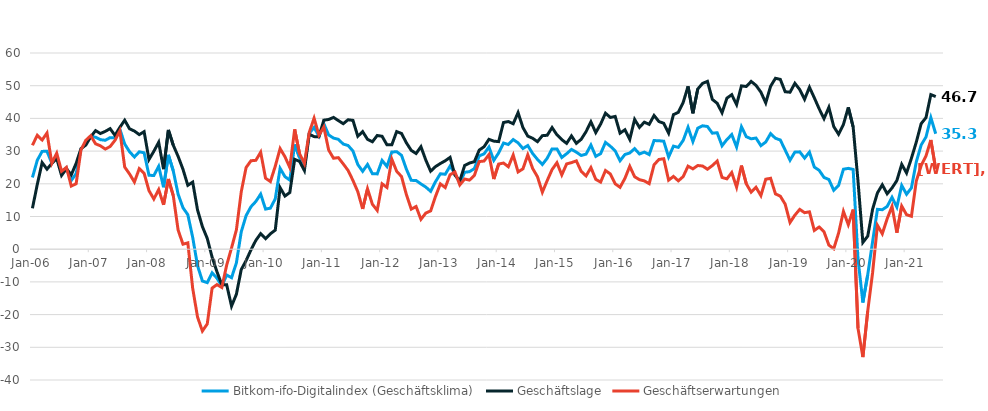
| Category | Bitkom-ifo-Digitalindex (Geschäftsklima) | Geschäftslage | Geschäftserwartungen |
|---|---|---|---|
| 2006-01-01 | 21.93 | 12.5 | 31.78 |
| 2006-02-01 | 27.2 | 19.8 | 34.84 |
| 2006-03-01 | 29.91 | 26.49 | 33.39 |
| 2006-04-01 | 29.94 | 24.48 | 35.54 |
| 2006-05-01 | 26.28 | 26.24 | 26.32 |
| 2006-06-01 | 28.53 | 27.71 | 29.36 |
| 2006-07-01 | 23.19 | 22.56 | 23.83 |
| 2006-08-01 | 24.81 | 24.6 | 25.03 |
| 2006-09-01 | 21.02 | 22.75 | 19.31 |
| 2006-10-01 | 23.11 | 26.25 | 20.01 |
| 2006-11-01 | 30.56 | 30.75 | 30.36 |
| 2006-12-01 | 32.58 | 31.85 | 33.32 |
| 2007-01-01 | 34.53 | 34.37 | 34.7 |
| 2007-02-01 | 34.23 | 36.26 | 32.23 |
| 2007-03-01 | 33.49 | 35.38 | 31.62 |
| 2007-04-01 | 33.31 | 36.03 | 30.62 |
| 2007-05-01 | 34.12 | 36.87 | 31.4 |
| 2007-06-01 | 34.05 | 34.81 | 33.3 |
| 2007-07-01 | 36.73 | 37.26 | 36.2 |
| 2007-08-01 | 32.17 | 39.44 | 25.12 |
| 2007-09-01 | 29.81 | 36.82 | 23 |
| 2007-10-01 | 28.2 | 36.13 | 20.54 |
| 2007-11-01 | 29.78 | 35.04 | 24.64 |
| 2007-12-01 | 29.49 | 35.94 | 23.22 |
| 2008-01-01 | 22.62 | 27.42 | 17.91 |
| 2008-02-01 | 22.53 | 29.95 | 15.35 |
| 2008-03-01 | 25.35 | 32.7 | 18.23 |
| 2008-04-01 | 18.96 | 24.47 | 13.58 |
| 2008-05-01 | 28.84 | 36.47 | 21.47 |
| 2008-06-01 | 23.97 | 31.81 | 16.39 |
| 2008-07-01 | 16.82 | 28.38 | 5.84 |
| 2008-08-01 | 12.68 | 24.44 | 1.53 |
| 2008-09-01 | 10.55 | 19.53 | 1.94 |
| 2008-10-01 | 3.62 | 20.52 | -11.98 |
| 2008-11-01 | -5.06 | 12 | -20.76 |
| 2008-12-01 | -9.73 | 6.91 | -25.03 |
| 2009-01-01 | -10.22 | 3.3 | -22.85 |
| 2009-02-01 | -7.22 | -2.43 | -11.89 |
| 2009-03-01 | -8.87 | -6.9 | -10.83 |
| 2009-04-01 | -11.29 | -10.88 | -11.7 |
| 2009-05-01 | -7.9 | -10.9 | -4.85 |
| 2009-06-01 | -8.72 | -17.41 | 0.39 |
| 2009-07-01 | -4.17 | -13.77 | 5.92 |
| 2009-08-01 | 5.32 | -6.22 | 17.55 |
| 2009-09-01 | 10.27 | -3.48 | 24.98 |
| 2009-10-01 | 12.99 | -0.21 | 27.05 |
| 2009-11-01 | 14.59 | 2.69 | 27.18 |
| 2009-12-01 | 16.85 | 4.76 | 29.66 |
| 2010-01-01 | 12.27 | 3.23 | 21.72 |
| 2010-02-01 | 12.55 | 4.71 | 20.68 |
| 2010-03-01 | 15.38 | 5.83 | 25.36 |
| 2010-04-01 | 24.72 | 18.83 | 30.77 |
| 2010-05-01 | 22.18 | 16.25 | 28.27 |
| 2010-06-01 | 21.13 | 17.34 | 24.98 |
| 2010-07-01 | 32.02 | 27.48 | 36.64 |
| 2010-08-01 | 28.04 | 26.86 | 29.23 |
| 2010-09-01 | 25.13 | 24.06 | 26.2 |
| 2010-10-01 | 35.44 | 35.16 | 35.72 |
| 2010-11-01 | 37.23 | 34.43 | 40.07 |
| 2010-12-01 | 34.59 | 34.36 | 34.83 |
| 2011-01-01 | 38.41 | 39.46 | 37.37 |
| 2011-02-01 | 34.94 | 39.67 | 30.31 |
| 2011-03-01 | 33.98 | 40.3 | 27.82 |
| 2011-04-01 | 33.6 | 39.33 | 28 |
| 2011-05-01 | 32.15 | 38.38 | 26.08 |
| 2011-06-01 | 31.71 | 39.59 | 24.09 |
| 2011-07-01 | 30.03 | 39.4 | 21.02 |
| 2011-08-01 | 25.9 | 34.54 | 17.58 |
| 2011-09-01 | 23.82 | 35.95 | 12.31 |
| 2011-10-01 | 25.91 | 33.6 | 18.47 |
| 2011-11-01 | 23.09 | 32.84 | 13.75 |
| 2011-12-01 | 23.03 | 34.78 | 11.86 |
| 2012-01-01 | 27.15 | 34.53 | 20 |
| 2012-02-01 | 25.31 | 31.92 | 18.89 |
| 2012-03-01 | 29.71 | 31.91 | 27.54 |
| 2012-04-01 | 29.82 | 35.97 | 23.83 |
| 2012-05-01 | 28.71 | 35.39 | 22.22 |
| 2012-06-01 | 24.49 | 32.54 | 16.72 |
| 2012-07-01 | 21.06 | 30.23 | 12.25 |
| 2012-08-01 | 21.01 | 29.26 | 13.05 |
| 2012-09-01 | 19.96 | 31.34 | 9.13 |
| 2012-10-01 | 19 | 27.26 | 11.05 |
| 2012-11-01 | 17.7 | 23.85 | 11.72 |
| 2012-12-01 | 20.64 | 25.25 | 16.13 |
| 2013-01-01 | 23.07 | 26.21 | 19.98 |
| 2013-02-01 | 22.91 | 27.04 | 18.85 |
| 2013-03-01 | 25.41 | 28.08 | 22.77 |
| 2013-04-01 | 23.13 | 22.65 | 23.62 |
| 2013-05-01 | 20.27 | 20.89 | 19.65 |
| 2013-06-01 | 23.51 | 25.59 | 21.46 |
| 2013-07-01 | 23.72 | 26.35 | 21.13 |
| 2013-08-01 | 24.65 | 26.76 | 22.56 |
| 2013-09-01 | 28.54 | 30.3 | 26.79 |
| 2013-10-01 | 29.15 | 31.34 | 26.97 |
| 2013-11-01 | 31.25 | 33.6 | 28.92 |
| 2013-12-01 | 27.17 | 33.05 | 21.44 |
| 2014-01-01 | 29.44 | 32.9 | 26.03 |
| 2014-02-01 | 32.47 | 38.75 | 26.35 |
| 2014-03-01 | 32.02 | 39.04 | 25.21 |
| 2014-04-01 | 33.53 | 38.36 | 28.8 |
| 2014-05-01 | 32.52 | 41.77 | 23.63 |
| 2014-06-01 | 30.79 | 37.2 | 24.56 |
| 2014-07-01 | 31.7 | 34.58 | 28.85 |
| 2014-08-01 | 29.26 | 33.92 | 24.7 |
| 2014-09-01 | 27.45 | 32.88 | 22.14 |
| 2014-10-01 | 25.91 | 34.72 | 17.43 |
| 2014-11-01 | 27.81 | 34.84 | 20.98 |
| 2014-12-01 | 30.68 | 37.19 | 24.35 |
| 2015-01-01 | 30.68 | 34.99 | 26.44 |
| 2015-02-01 | 28.05 | 33.51 | 22.71 |
| 2015-03-01 | 29.2 | 32.37 | 26.08 |
| 2015-04-01 | 30.52 | 34.64 | 26.48 |
| 2015-05-01 | 29.68 | 32.37 | 27.01 |
| 2015-06-01 | 28.66 | 33.61 | 23.81 |
| 2015-07-01 | 29.08 | 35.95 | 22.41 |
| 2015-08-01 | 31.85 | 38.95 | 24.96 |
| 2015-09-01 | 28.39 | 35.66 | 21.36 |
| 2015-10-01 | 29.22 | 38.26 | 20.52 |
| 2015-11-01 | 32.66 | 41.59 | 24.06 |
| 2015-12-01 | 31.49 | 40.29 | 23.01 |
| 2016-01-01 | 30.07 | 40.6 | 20 |
| 2016-02-01 | 27.06 | 35.49 | 18.93 |
| 2016-03-01 | 28.96 | 36.52 | 21.65 |
| 2016-04-01 | 29.43 | 33.58 | 25.35 |
| 2016-05-01 | 30.76 | 39.69 | 22.16 |
| 2016-06-01 | 29.12 | 37.25 | 21.26 |
| 2016-07-01 | 29.7 | 38.85 | 20.89 |
| 2016-08-01 | 28.93 | 38.18 | 20.04 |
| 2016-09-01 | 33.22 | 40.89 | 25.8 |
| 2016-10-01 | 33.17 | 39.04 | 27.44 |
| 2016-11-01 | 33.02 | 38.51 | 27.66 |
| 2016-12-01 | 28.19 | 35.5 | 21.11 |
| 2017-01-01 | 31.52 | 41.16 | 22.26 |
| 2017-02-01 | 31.14 | 41.85 | 20.9 |
| 2017-03-01 | 33.27 | 44.88 | 22.21 |
| 2017-04-01 | 37.28 | 49.8 | 25.39 |
| 2017-05-01 | 32.91 | 41.56 | 24.57 |
| 2017-06-01 | 37 | 48.99 | 25.59 |
| 2017-07-01 | 37.74 | 50.71 | 25.44 |
| 2017-08-01 | 37.52 | 51.33 | 24.46 |
| 2017-09-01 | 35.48 | 45.82 | 25.57 |
| 2017-10-01 | 35.62 | 44.63 | 26.95 |
| 2017-11-01 | 31.63 | 41.73 | 21.95 |
| 2017-12-01 | 33.53 | 46.19 | 21.51 |
| 2018-01-01 | 35.05 | 47.25 | 23.45 |
| 2018-02-01 | 31.24 | 44.21 | 18.97 |
| 2018-03-01 | 37.44 | 49.94 | 25.57 |
| 2018-04-01 | 34.4 | 49.76 | 19.98 |
| 2018-05-01 | 33.76 | 51.31 | 17.43 |
| 2018-06-01 | 33.99 | 50.09 | 18.92 |
| 2018-07-01 | 31.67 | 48.04 | 16.39 |
| 2018-08-01 | 32.78 | 44.75 | 21.4 |
| 2018-09-01 | 35.34 | 49.83 | 21.69 |
| 2018-10-01 | 33.92 | 52.27 | 16.91 |
| 2018-11-01 | 33.4 | 51.93 | 16.22 |
| 2018-12-01 | 30.32 | 48.16 | 13.77 |
| 2019-01-01 | 27.21 | 48 | 8.17 |
| 2019-02-01 | 29.69 | 50.73 | 10.41 |
| 2019-03-01 | 29.77 | 48.82 | 12.18 |
| 2019-04-01 | 27.86 | 45.86 | 11.17 |
| 2019-05-01 | 29.69 | 49.53 | 11.43 |
| 2019-06-01 | 25.11 | 46.3 | 5.74 |
| 2019-07-01 | 24.13 | 42.93 | 6.78 |
| 2019-08-01 | 21.94 | 39.93 | 5.31 |
| 2019-09-01 | 21.31 | 43.38 | 1.25 |
| 2019-10-01 | 18.03 | 37.51 | 0.14 |
| 2019-11-01 | 19.51 | 35.15 | 4.92 |
| 2019-12-01 | 24.46 | 38.16 | 11.55 |
| 2020-01-01 | 24.72 | 43.38 | 7.5 |
| 2020-02-01 | 24.4 | 37.38 | 12.12 |
| 2020-03-01 | -2.99 | 20.82 | -24.22 |
| 2020-04-01 | -16.3 | 2.07 | -33 |
| 2020-05-01 | -7.82 | 4 | -18.95 |
| 2020-06-01 | 2.28 | 12.21 | -7.19 |
| 2020-07-01 | 12.21 | 17.21 | 7.32 |
| 2020-08-01 | 12.08 | 19.7 | 4.72 |
| 2020-09-01 | 13.1 | 16.95 | 9.31 |
| 2020-10-01 | 15.88 | 18.72 | 13.07 |
| 2020-11-01 | 12.87 | 20.99 | 5.05 |
| 2020-12-01 | 19.48 | 25.95 | 13.19 |
| 2021-01-01 | 16.82 | 23.3 | 10.53 |
| 2021-02-01 | 18.78 | 27.83 | 10.08 |
| 2021-03-01 | 26.73 | 32.75 | 20.86 |
| 2021-04-01 | 31.87 | 38.38 | 25.54 |
| 2021-05-01 | 34.31 | 40.25 | 28.5 |
| 2021-06-01 | 40.24 | 47.28 | 33.4 |
| 2021-07-01 | 35.32 | 46.68 | 24.47 |